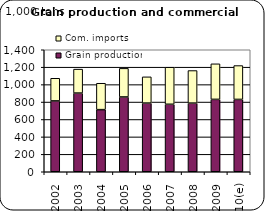
| Category | Grain production | Com. imports |
|---|---|---|
| 2002 | 812.96 | 259.981 |
| 2003 | 902.929 | 274.747 |
| 2004 | 712.739 | 302.865 |
| 2005 | 858.188 | 328.329 |
| 2006 | 788.197 | 301.019 |
| 2007 | 774.3 | 425.113 |
| 2008 | 787.835 | 373.613 |
| 2009 | 830.7 | 407.93 |
| 2010(e) | 830 | 388.599 |